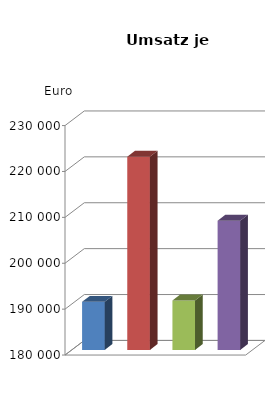
| Category | Umsatz je Beschäftigten |
|---|---|
| Vorl.güter/Energie | 190485.166 |
| Investitionsgüterproduzenten | 222104.856 |
| Gebrauchsgüterproduzenten | 190782.414 |
| Verbrauchsgüterproduzenten | 208153.515 |